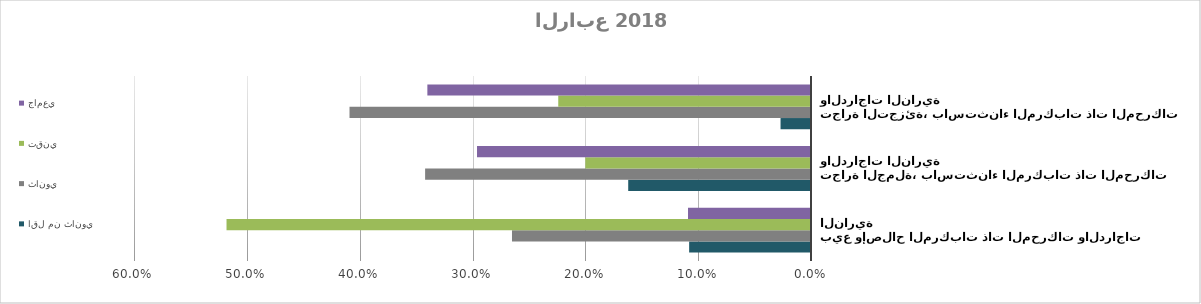
| Category | اقل من ثانوي | ثانوي | تقني | جامعي |
|---|---|---|---|---|
| بيع وإصلاح المركبات ذات المحركات والدراجات النارية | 0.108 | 0.265 | 0.518 | 0.109 |
| تجارة الجملة، باستثناء المركبات ذات المحركات والدراجات النارية | 0.162 | 0.342 | 0.2 | 0.296 |
| تجارة التجزئة، باستثناء المركبات ذات المحركات والدراجات النارية | 0.027 | 0.409 | 0.224 | 0.34 |